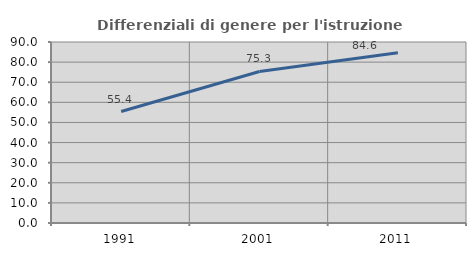
| Category | Differenziali di genere per l'istruzione superiore |
|---|---|
| 1991.0 | 55.415 |
| 2001.0 | 75.34 |
| 2011.0 | 84.623 |